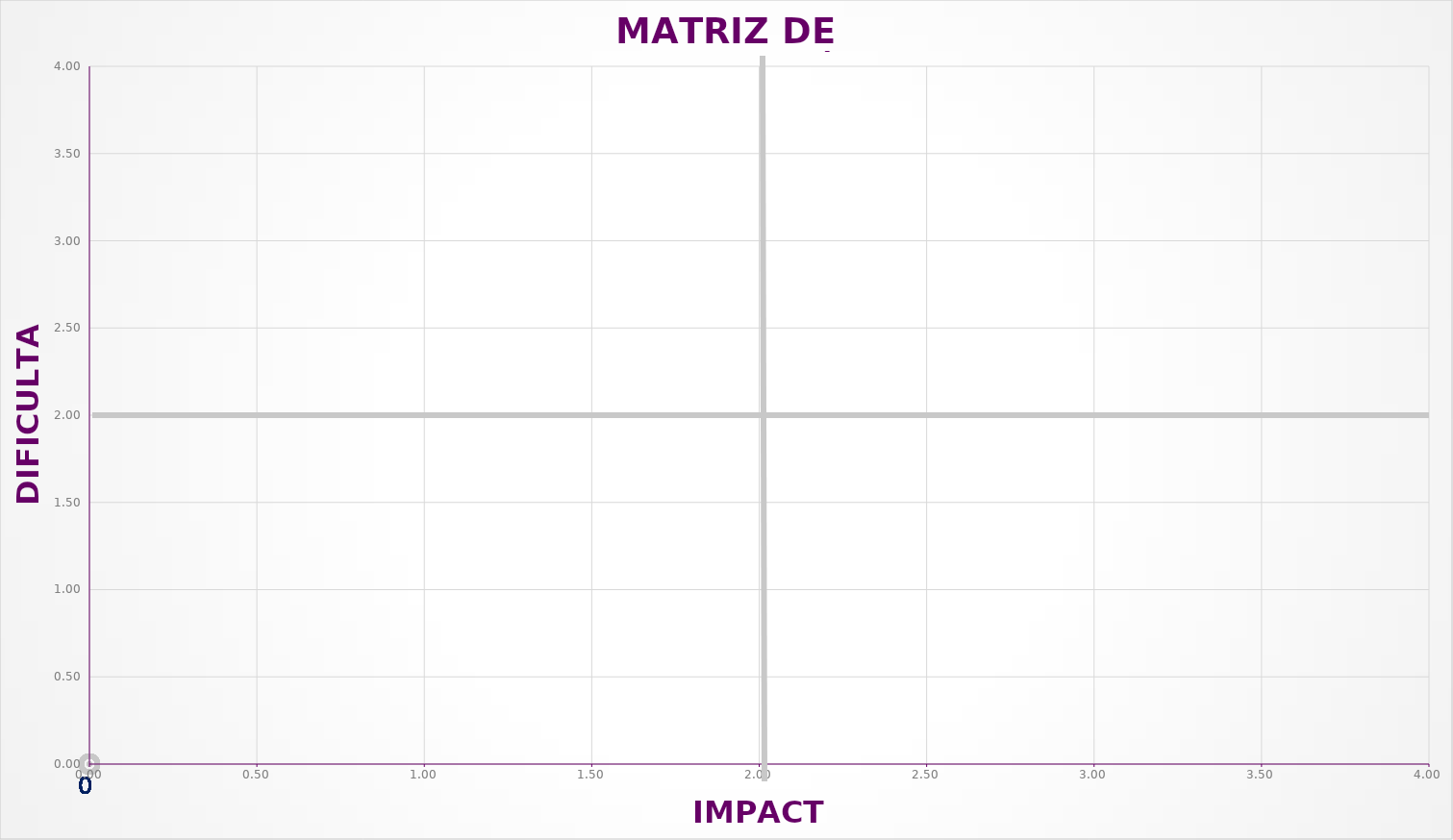
| Category | Series 0 |
|---|---|
| 0.0 | 0 |
| 0.0 | 0 |
| 0.0 | 0 |
| 0.0 | 0 |
| 0.0 | 0 |
| 0.0 | 0 |
| 0.0 | 0 |
| 0.0 | 0 |
| 0.0 | 0 |
| 0.0 | 0 |
| 0.0 | 0 |
| 0.0 | 0 |
| 0.0 | 0 |
| 0.0 | 0 |
| 0.0 | 0 |
| 0.0 | 0 |
| 0.0 | 0 |
| 0.0 | 0 |
| 0.0 | 0 |
| 0.0 | 0 |
| 0.0 | 0 |
| 0.0 | 0 |
| 0.0 | 0 |
| 0.0 | 0 |
| 0.0 | 0 |
| 0.0 | 0 |
| 0.0 | 0 |
| 0.0 | 0 |
| 0.0 | 0 |
| 0.0 | 0 |
| 0.0 | 0 |
| 0.0 | 0 |
| 0.0 | 0 |
| 0.0 | 0 |
| 0.0 | 0 |
| 0.0 | 0 |
| 0.0 | 0 |
| 0.0 | 0 |
| 0.0 | 0 |
| 0.0 | 0 |
| 0.0 | 0 |
| 0.0 | 0 |
| 0.0 | 0 |
| 0.0 | 0 |
| 0.0 | 0 |
| 0.0 | 0 |
| 0.0 | 0 |
| 0.0 | 0 |
| 0.0 | 0 |
| 0.0 | 0 |
| 0.0 | 0 |
| 0.0 | 0 |
| 0.0 | 0 |
| 0.0 | 0 |
| 0.0 | 0 |
| 0.0 | 0 |
| 0.0 | 0 |
| 0.0 | 0 |
| 0.0 | 0 |
| 0.0 | 0 |
| 0.0 | 0 |
| 0.0 | 0 |
| 0.0 | 0 |
| 0.0 | 0 |
| 0.0 | 0 |
| 0.0 | 0 |
| 0.0 | 0 |
| 0.0 | 0 |
| 0.0 | 0 |
| 0.0 | 0 |
| 0.0 | 0 |
| 0.0 | 0 |
| 0.0 | 0 |
| 0.0 | 0 |
| 0.0 | 0 |
| 0.0 | 0 |
| 0.0 | 0 |
| 0.0 | 0 |
| 0.0 | 0 |
| 0.0 | 0 |
| 0.0 | 0 |
| 0.0 | 0 |
| 0.0 | 0 |
| 0.0 | 0 |
| 0.0 | 0 |
| 0.0 | 0 |
| 0.0 | 0 |
| 0.0 | 0 |
| 0.0 | 0 |
| 0.0 | 0 |
| 0.0 | 0 |
| 0.0 | 0 |
| 0.0 | 0 |
| 0.0 | 0 |
| 0.0 | 0 |
| 0.0 | 0 |
| 0.0 | 0 |
| 0.0 | 0 |
| 0.0 | 0 |
| 0.0 | 0 |
| 0.0 | 0 |
| 0.0 | 0 |
| 0.0 | 0 |
| 0.0 | 0 |
| 0.0 | 0 |
| 0.0 | 0 |
| 0.0 | 0 |
| 0.0 | 0 |
| 0.0 | 0 |
| 0.0 | 0 |
| 0.0 | 0 |
| 0.0 | 0 |
| 0.0 | 0 |
| 0.0 | 0 |
| 0.0 | 0 |
| 0.0 | 0 |
| 0.0 | 0 |
| 0.0 | 0 |
| 0.0 | 0 |
| 0.0 | 0 |
| 0.0 | 0 |
| 0.0 | 0 |
| 0.0 | 0 |
| 0.0 | 0 |
| 0.0 | 0 |
| 0.0 | 0 |
| 0.0 | 0 |
| 0.0 | 0 |
| 0.0 | 0 |
| 0.0 | 0 |
| 0.0 | 0 |
| 0.0 | 0 |
| 0.0 | 0 |
| 0.0 | 0 |
| 0.0 | 0 |
| 0.0 | 0 |
| 0.0 | 0 |
| 0.0 | 0 |
| 0.0 | 0 |
| 0.0 | 0 |
| 0.0 | 0 |
| 0.0 | 0 |
| 0.0 | 0 |
| 0.0 | 0 |
| 0.0 | 0 |
| 0.0 | 0 |
| 0.0 | 0 |
| 0.0 | 0 |
| 0.0 | 0 |
| 0.0 | 0 |
| 0.0 | 0 |
| 0.0 | 0 |
| 0.0 | 0 |
| 0.0 | 0 |
| 0.0 | 0 |
| 0.0 | 0 |
| 0.0 | 0 |
| 0.0 | 0 |
| 0.0 | 0 |
| 0.0 | 0 |
| 0.0 | 0 |
| 0.0 | 0 |
| 0.0 | 0 |
| 0.0 | 0 |
| 0.0 | 0 |
| 0.0 | 0 |
| 0.0 | 0 |
| 0.0 | 0 |
| 0.0 | 0 |
| 0.0 | 0 |
| 0.0 | 0 |
| 0.0 | 0 |
| 0.0 | 0 |
| 0.0 | 0 |
| 0.0 | 0 |
| 0.0 | 0 |
| 0.0 | 0 |
| 0.0 | 0 |
| 0.0 | 0 |
| 0.0 | 0 |
| 0.0 | 0 |
| 0.0 | 0 |
| 0.0 | 0 |
| 0.0 | 0 |
| 0.0 | 0 |
| 0.0 | 0 |
| 0.0 | 0 |
| 0.0 | 0 |
| 0.0 | 0 |
| 0.0 | 0 |
| 0.0 | 0 |
| 0.0 | 0 |
| 0.0 | 0 |
| 0.0 | 0 |
| 0.0 | 0 |
| 0.0 | 0 |
| 0.0 | 0 |
| 0.0 | 0 |
| 0.0 | 0 |
| 0.0 | 0 |
| 0.0 | 0 |
| 0.0 | 0 |
| 0.0 | 0 |
| 0.0 | 0 |
| 0.0 | 0 |
| 0.0 | 0 |
| 0.0 | 0 |
| 0.0 | 0 |
| 0.0 | 0 |
| 0.0 | 0 |
| 0.0 | 0 |
| 0.0 | 0 |
| 0.0 | 0 |
| 0.0 | 0 |
| 0.0 | 0 |
| 0.0 | 0 |
| 0.0 | 0 |
| 0.0 | 0 |
| 0.0 | 0 |
| 0.0 | 0 |
| 0.0 | 0 |
| 0.0 | 0 |
| 0.0 | 0 |
| 0.0 | 0 |
| 0.0 | 0 |
| 0.0 | 0 |
| 0.0 | 0 |
| 0.0 | 0 |
| 0.0 | 0 |
| 0.0 | 0 |
| 0.0 | 0 |
| 0.0 | 0 |
| 0.0 | 0 |
| 0.0 | 0 |
| 0.0 | 0 |
| 0.0 | 0 |
| 0.0 | 0 |
| 0.0 | 0 |
| 0.0 | 0 |
| 0.0 | 0 |
| 0.0 | 0 |
| 0.0 | 0 |
| 0.0 | 0 |
| 0.0 | 0 |
| 0.0 | 0 |
| 0.0 | 0 |
| 0.0 | 0 |
| 0.0 | 0 |
| 0.0 | 0 |
| 0.0 | 0 |
| 0.0 | 0 |
| 0.0 | 0 |
| 0.0 | 0 |
| 0.0 | 0 |
| 0.0 | 0 |
| 0.0 | 0 |
| 0.0 | 0 |
| 0.0 | 0 |
| 0.0 | 0 |
| 0.0 | 0 |
| 0.0 | 0 |
| 0.0 | 0 |
| 0.0 | 0 |
| 0.0 | 0 |
| 0.0 | 0 |
| 0.0 | 0 |
| 0.0 | 0 |
| 0.0 | 0 |
| 0.0 | 0 |
| 0.0 | 0 |
| 0.0 | 0 |
| 0.0 | 0 |
| 0.0 | 0 |
| 0.0 | 0 |
| 0.0 | 0 |
| 0.0 | 0 |
| 0.0 | 0 |
| 0.0 | 0 |
| 0.0 | 0 |
| 0.0 | 0 |
| 0.0 | 0 |
| 0.0 | 0 |
| 0.0 | 0 |
| 0.0 | 0 |
| 0.0 | 0 |
| 0.0 | 0 |
| 0.0 | 0 |
| 0.0 | 0 |
| 0.0 | 0 |
| 0.0 | 0 |
| 0.0 | 0 |
| 0.0 | 0 |
| 0.0 | 0 |
| 0.0 | 0 |
| 0.0 | 0 |
| 0.0 | 0 |
| 0.0 | 0 |
| 0.0 | 0 |
| 0.0 | 0 |
| 0.0 | 0 |
| 0.0 | 0 |
| 0.0 | 0 |
| 0.0 | 0 |
| 0.0 | 0 |
| 0.0 | 0 |
| 0.0 | 0 |
| 0.0 | 0 |
| 0.0 | 0 |
| 0.0 | 0 |
| 0.0 | 0 |
| 0.0 | 0 |
| 0.0 | 0 |
| 0.0 | 0 |
| 0.0 | 0 |
| 0.0 | 0 |
| 0.0 | 0 |
| 0.0 | 0 |
| 0.0 | 0 |
| 0.0 | 0 |
| 0.0 | 0 |
| 0.0 | 0 |
| 0.0 | 0 |
| 0.0 | 0 |
| 0.0 | 0 |
| 0.0 | 0 |
| 0.0 | 0 |
| 0.0 | 0 |
| 0.0 | 0 |
| 0.0 | 0 |
| 0.0 | 0 |
| 0.0 | 0 |
| 0.0 | 0 |
| 0.0 | 0 |
| 0.0 | 0 |
| 0.0 | 0 |
| 0.0 | 0 |
| 0.0 | 0 |
| 0.0 | 0 |
| 0.0 | 0 |
| 0.0 | 0 |
| 0.0 | 0 |
| 0.0 | 0 |
| 0.0 | 0 |
| 0.0 | 0 |
| 0.0 | 0 |
| 0.0 | 0 |
| 0.0 | 0 |
| 0.0 | 0 |
| 0.0 | 0 |
| 0.0 | 0 |
| 0.0 | 0 |
| 0.0 | 0 |
| 0.0 | 0 |
| 0.0 | 0 |
| 0.0 | 0 |
| 0.0 | 0 |
| 0.0 | 0 |
| 0.0 | 0 |
| 0.0 | 0 |
| 0.0 | 0 |
| 0.0 | 0 |
| 0.0 | 0 |
| 0.0 | 0 |
| 0.0 | 0 |
| 0.0 | 0 |
| 0.0 | 0 |
| 0.0 | 0 |
| 0.0 | 0 |
| 0.0 | 0 |
| 0.0 | 0 |
| 0.0 | 0 |
| 0.0 | 0 |
| 0.0 | 0 |
| 0.0 | 0 |
| 0.0 | 0 |
| 0.0 | 0 |
| 0.0 | 0 |
| 0.0 | 0 |
| 0.0 | 0 |
| 0.0 | 0 |
| 0.0 | 0 |
| 0.0 | 0 |
| 0.0 | 0 |
| 0.0 | 0 |
| 0.0 | 0 |
| 0.0 | 0 |
| 0.0 | 0 |
| 0.0 | 0 |
| 0.0 | 0 |
| 0.0 | 0 |
| 0.0 | 0 |
| 0.0 | 0 |
| 0.0 | 0 |
| 0.0 | 0 |
| 0.0 | 0 |
| 0.0 | 0 |
| 0.0 | 0 |
| 0.0 | 0 |
| 0.0 | 0 |
| 0.0 | 0 |
| 0.0 | 0 |
| 0.0 | 0 |
| 0.0 | 0 |
| 0.0 | 0 |
| 0.0 | 0 |
| 0.0 | 0 |
| 0.0 | 0 |
| 0.0 | 0 |
| 0.0 | 0 |
| 0.0 | 0 |
| 0.0 | 0 |
| 0.0 | 0 |
| 0.0 | 0 |
| 0.0 | 0 |
| 0.0 | 0 |
| 0.0 | 0 |
| 0.0 | 0 |
| 0.0 | 0 |
| 0.0 | 0 |
| 0.0 | 0 |
| 0.0 | 0 |
| 0.0 | 0 |
| 0.0 | 0 |
| 0.0 | 0 |
| 0.0 | 0 |
| 0.0 | 0 |
| 0.0 | 0 |
| 0.0 | 0 |
| 0.0 | 0 |
| 0.0 | 0 |
| 0.0 | 0 |
| 0.0 | 0 |
| 0.0 | 0 |
| 0.0 | 0 |
| 0.0 | 0 |
| 0.0 | 0 |
| 0.0 | 0 |
| 0.0 | 0 |
| 0.0 | 0 |
| 0.0 | 0 |
| 0.0 | 0 |
| 0.0 | 0 |
| 0.0 | 0 |
| 0.0 | 0 |
| 0.0 | 0 |
| 0.0 | 0 |
| 0.0 | 0 |
| 0.0 | 0 |
| 0.0 | 0 |
| 0.0 | 0 |
| 0.0 | 0 |
| 0.0 | 0 |
| 0.0 | 0 |
| 0.0 | 0 |
| 0.0 | 0 |
| 0.0 | 0 |
| 0.0 | 0 |
| 0.0 | 0 |
| 0.0 | 0 |
| 0.0 | 0 |
| 0.0 | 0 |
| 0.0 | 0 |
| 0.0 | 0 |
| 0.0 | 0 |
| 0.0 | 0 |
| 0.0 | 0 |
| 0.0 | 0 |
| 0.0 | 0 |
| 0.0 | 0 |
| 0.0 | 0 |
| 0.0 | 0 |
| 0.0 | 0 |
| 0.0 | 0 |
| 0.0 | 0 |
| 0.0 | 0 |
| 0.0 | 0 |
| 0.0 | 0 |
| 0.0 | 0 |
| 0.0 | 0 |
| 0.0 | 0 |
| 0.0 | 0 |
| 0.0 | 0 |
| 0.0 | 0 |
| 0.0 | 0 |
| 0.0 | 0 |
| 0.0 | 0 |
| 0.0 | 0 |
| 0.0 | 0 |
| 0.0 | 0 |
| 0.0 | 0 |
| 0.0 | 0 |
| 0.0 | 0 |
| 0.0 | 0 |
| 0.0 | 0 |
| 0.0 | 0 |
| 0.0 | 0 |
| 0.0 | 0 |
| 0.0 | 0 |
| 0.0 | 0 |
| 0.0 | 0 |
| 0.0 | 0 |
| 0.0 | 0 |
| 0.0 | 0 |
| 0.0 | 0 |
| 0.0 | 0 |
| 0.0 | 0 |
| 0.0 | 0 |
| 0.0 | 0 |
| 0.0 | 0 |
| 0.0 | 0 |
| 0.0 | 0 |
| 0.0 | 0 |
| 0.0 | 0 |
| 0.0 | 0 |
| 0.0 | 0 |
| 0.0 | 0 |
| 0.0 | 0 |
| 0.0 | 0 |
| 0.0 | 0 |
| 0.0 | 0 |
| 0.0 | 0 |
| 0.0 | 0 |
| 0.0 | 0 |
| 0.0 | 0 |
| 0.0 | 0 |
| 0.0 | 0 |
| 0.0 | 0 |
| 0.0 | 0 |
| 0.0 | 0 |
| 0.0 | 0 |
| 0.0 | 0 |
| 0.0 | 0 |
| 0.0 | 0 |
| 0.0 | 0 |
| 0.0 | 0 |
| 0.0 | 0 |
| 0.0 | 0 |
| 0.0 | 0 |
| 0.0 | 0 |
| 0.0 | 0 |
| 0.0 | 0 |
| 0.0 | 0 |
| 0.0 | 0 |
| 0.0 | 0 |
| 0.0 | 0 |
| 0.0 | 0 |
| 0.0 | 0 |
| 0.0 | 0 |
| 0.0 | 0 |
| 0.0 | 0 |
| 0.0 | 0 |
| 0.0 | 0 |
| 0.0 | 0 |
| 0.0 | 0 |
| 0.0 | 0 |
| 0.0 | 0 |
| 0.0 | 0 |
| 0.0 | 0 |
| 0.0 | 0 |
| 0.0 | 0 |
| 0.0 | 0 |
| 0.0 | 0 |
| 0.0 | 0 |
| 0.0 | 0 |
| 0.0 | 0 |
| 0.0 | 0 |
| 0.0 | 0 |
| 0.0 | 0 |
| 0.0 | 0 |
| 0.0 | 0 |
| 0.0 | 0 |
| 0.0 | 0 |
| 0.0 | 0 |
| 0.0 | 0 |
| 0.0 | 0 |
| 0.0 | 0 |
| 0.0 | 0 |
| 0.0 | 0 |
| 0.0 | 0 |
| 0.0 | 0 |
| 0.0 | 0 |
| 0.0 | 0 |
| 0.0 | 0 |
| 0.0 | 0 |
| 0.0 | 0 |
| 0.0 | 0 |
| 0.0 | 0 |
| 0.0 | 0 |
| 0.0 | 0 |
| 0.0 | 0 |
| 0.0 | 0 |
| 0.0 | 0 |
| 0.0 | 0 |
| 0.0 | 0 |
| 0.0 | 0 |
| 0.0 | 0 |
| 0.0 | 0 |
| 0.0 | 0 |
| 0.0 | 0 |
| 0.0 | 0 |
| 0.0 | 0 |
| 0.0 | 0 |
| 0.0 | 0 |
| 0.0 | 0 |
| 0.0 | 0 |
| 0.0 | 0 |
| 0.0 | 0 |
| 0.0 | 0 |
| 0.0 | 0 |
| 0.0 | 0 |
| 0.0 | 0 |
| 0.0 | 0 |
| 0.0 | 0 |
| 0.0 | 0 |
| 0.0 | 0 |
| 0.0 | 0 |
| 0.0 | 0 |
| 0.0 | 0 |
| 0.0 | 0 |
| 0.0 | 0 |
| 0.0 | 0 |
| 0.0 | 0 |
| 0.0 | 0 |
| 0.0 | 0 |
| 0.0 | 0 |
| 0.0 | 0 |
| 0.0 | 0 |
| 0.0 | 0 |
| 0.0 | 0 |
| 0.0 | 0 |
| 0.0 | 0 |
| 0.0 | 0 |
| 0.0 | 0 |
| 0.0 | 0 |
| 0.0 | 0 |
| 0.0 | 0 |
| 0.0 | 0 |
| 0.0 | 0 |
| 0.0 | 0 |
| 0.0 | 0 |
| 0.0 | 0 |
| 0.0 | 0 |
| 0.0 | 0 |
| 0.0 | 0 |
| 0.0 | 0 |
| 0.0 | 0 |
| 0.0 | 0 |
| 0.0 | 0 |
| 0.0 | 0 |
| 0.0 | 0 |
| 0.0 | 0 |
| 0.0 | 0 |
| 0.0 | 0 |
| 0.0 | 0 |
| 0.0 | 0 |
| 0.0 | 0 |
| 0.0 | 0 |
| 0.0 | 0 |
| 0.0 | 0 |
| 0.0 | 0 |
| 0.0 | 0 |
| 0.0 | 0 |
| 0.0 | 0 |
| 0.0 | 0 |
| 0.0 | 0 |
| 0.0 | 0 |
| 0.0 | 0 |
| 0.0 | 0 |
| 0.0 | 0 |
| 0.0 | 0 |
| 0.0 | 0 |
| 0.0 | 0 |
| 0.0 | 0 |
| 0.0 | 0 |
| 0.0 | 0 |
| 0.0 | 0 |
| 0.0 | 0 |
| 0.0 | 0 |
| 0.0 | 0 |
| 0.0 | 0 |
| 0.0 | 0 |
| 0.0 | 0 |
| 0.0 | 0 |
| 0.0 | 0 |
| 0.0 | 0 |
| 0.0 | 0 |
| 0.0 | 0 |
| 0.0 | 0 |
| 0.0 | 0 |
| 0.0 | 0 |
| 0.0 | 0 |
| 0.0 | 0 |
| 0.0 | 0 |
| 0.0 | 0 |
| 0.0 | 0 |
| 0.0 | 0 |
| 0.0 | 0 |
| 0.0 | 0 |
| 0.0 | 0 |
| 0.0 | 0 |
| 0.0 | 0 |
| 0.0 | 0 |
| 0.0 | 0 |
| 0.0 | 0 |
| 0.0 | 0 |
| 0.0 | 0 |
| 0.0 | 0 |
| 0.0 | 0 |
| 0.0 | 0 |
| 0.0 | 0 |
| 0.0 | 0 |
| 0.0 | 0 |
| 0.0 | 0 |
| 0.0 | 0 |
| 0.0 | 0 |
| 0.0 | 0 |
| 0.0 | 0 |
| 0.0 | 0 |
| 0.0 | 0 |
| 0.0 | 0 |
| 0.0 | 0 |
| 0.0 | 0 |
| 0.0 | 0 |
| 0.0 | 0 |
| 0.0 | 0 |
| 0.0 | 0 |
| 0.0 | 0 |
| 0.0 | 0 |
| 0.0 | 0 |
| 0.0 | 0 |
| 0.0 | 0 |
| 0.0 | 0 |
| 0.0 | 0 |
| 0.0 | 0 |
| 0.0 | 0 |
| 0.0 | 0 |
| 0.0 | 0 |
| 0.0 | 0 |
| 0.0 | 0 |
| 0.0 | 0 |
| 0.0 | 0 |
| 0.0 | 0 |
| 0.0 | 0 |
| 0.0 | 0 |
| 0.0 | 0 |
| 0.0 | 0 |
| 0.0 | 0 |
| 0.0 | 0 |
| 0.0 | 0 |
| 0.0 | 0 |
| 0.0 | 0 |
| 0.0 | 0 |
| 0.0 | 0 |
| 0.0 | 0 |
| 0.0 | 0 |
| 0.0 | 0 |
| 0.0 | 0 |
| 0.0 | 0 |
| 0.0 | 0 |
| 0.0 | 0 |
| 0.0 | 0 |
| 0.0 | 0 |
| 0.0 | 0 |
| 0.0 | 0 |
| 0.0 | 0 |
| 0.0 | 0 |
| 0.0 | 0 |
| 0.0 | 0 |
| 0.0 | 0 |
| 0.0 | 0 |
| 0.0 | 0 |
| 0.0 | 0 |
| 0.0 | 0 |
| 0.0 | 0 |
| 0.0 | 0 |
| 0.0 | 0 |
| 0.0 | 0 |
| 0.0 | 0 |
| 0.0 | 0 |
| 0.0 | 0 |
| 0.0 | 0 |
| 0.0 | 0 |
| 0.0 | 0 |
| 0.0 | 0 |
| 0.0 | 0 |
| 0.0 | 0 |
| 0.0 | 0 |
| 0.0 | 0 |
| 0.0 | 0 |
| 0.0 | 0 |
| 0.0 | 0 |
| 0.0 | 0 |
| 0.0 | 0 |
| 0.0 | 0 |
| 0.0 | 0 |
| 0.0 | 0 |
| 0.0 | 0 |
| 0.0 | 0 |
| 0.0 | 0 |
| 0.0 | 0 |
| 0.0 | 0 |
| 0.0 | 0 |
| 0.0 | 0 |
| 0.0 | 0 |
| 0.0 | 0 |
| 0.0 | 0 |
| 0.0 | 0 |
| 0.0 | 0 |